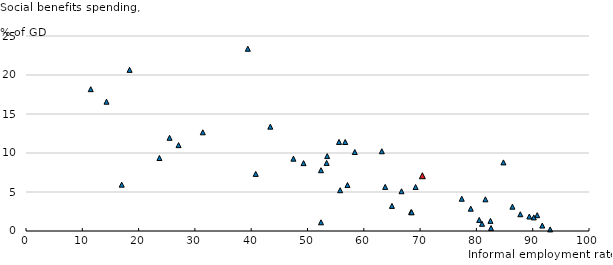
| Category | Social benefits spending, % of GDP |
|---|---|
| 86.4 | 3.116 |
| 56.7 | 11.409 |
| 49.3 | 8.702 |
| 25.5 | 11.95 |
| 14.3 | 16.577 |
| 39.4 | 23.364 |
| 27.1 | 11.01 |
| 91.7 | 0.697 |
| 63.2 | 10.225 |
| 63.8 | 5.654 |
| 40.8 | 7.324 |
| 66.7 | 5.098 |
| 55.6 | 11.42 |
| 79.0 | 2.86 |
| 82.6 | 0.375 |
| 80.5 | 1.42 |
| 53.4 | 8.729 |
| 58.4 | 10.127 |
| 89.4 | 1.859 |
| 47.5 | 9.272 |
| 57.1 | 5.89 |
| 23.7 | 9.357 |
| 11.5 | 18.185 |
| 81.0 | 0.924 |
| 43.4 | 13.376 |
| 53.5 | 9.605 |
| 55.8 | 5.228 |
| 81.6 | 4.061 |
| 68.4 | 2.424 |
| 69.2 | 5.641 |
| 87.8 | 2.146 |
| 90.2 | 1.744 |
| 68.5 | 2.401 |
| 82.5 | 1.299 |
| 18.4 | 20.658 |
| 17.0 | 5.939 |
| 65.0 | 3.218 |
| 84.8 | 8.795 |
| 52.4 | 7.791 |
| 31.4 | 12.656 |
| 90.8 | 2.028 |
| 93.1 | 0.204 |
| 70.4 | 7.086 |
| 52.4 | 1.112 |
| 77.4 | 4.135 |